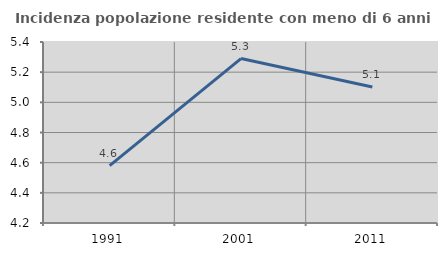
| Category | Incidenza popolazione residente con meno di 6 anni |
|---|---|
| 1991.0 | 4.581 |
| 2001.0 | 5.29 |
| 2011.0 | 5.101 |